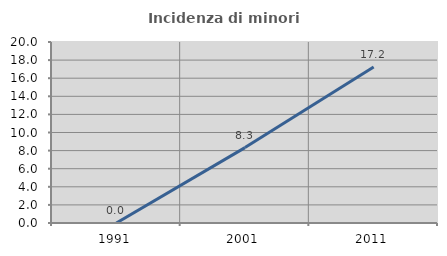
| Category | Incidenza di minori stranieri |
|---|---|
| 1991.0 | 0 |
| 2001.0 | 8.333 |
| 2011.0 | 17.241 |